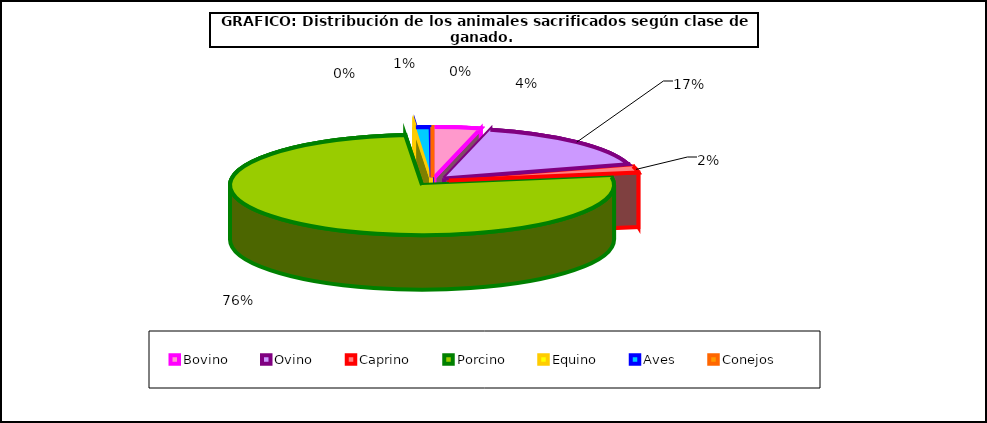
| Category | Series 0 |
|---|---|
| 0 | 2333895 |
| 1 | 9960176 |
| 2 | 1210269 |
| 3 | 45890524 |
| 4 | 52908 |
| 5 | 736455 |
| 6 | 51880.278 |